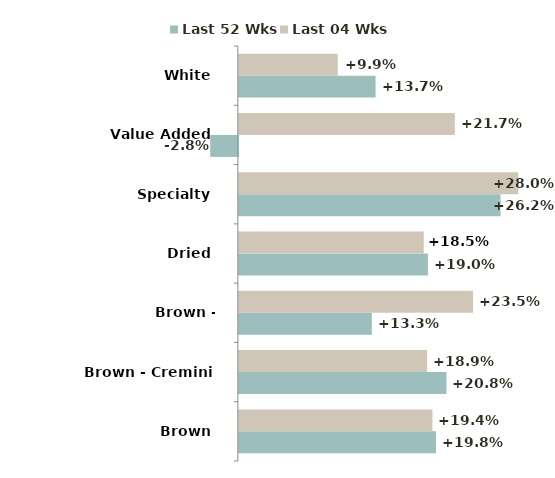
| Category | Last 52 Wks | Last 04 Wks |
|---|---|---|
| Brown | 0.198 | 0.194 |
| Brown - Cremini | 0.208 | 0.189 |
| Brown - Portabella | 0.133 | 0.235 |
| Dried | 0.19 | 0.185 |
| Specialty | 0.262 | 0.28 |
| Value Added | -0.028 | 0.217 |
| White | 0.137 | 0.099 |